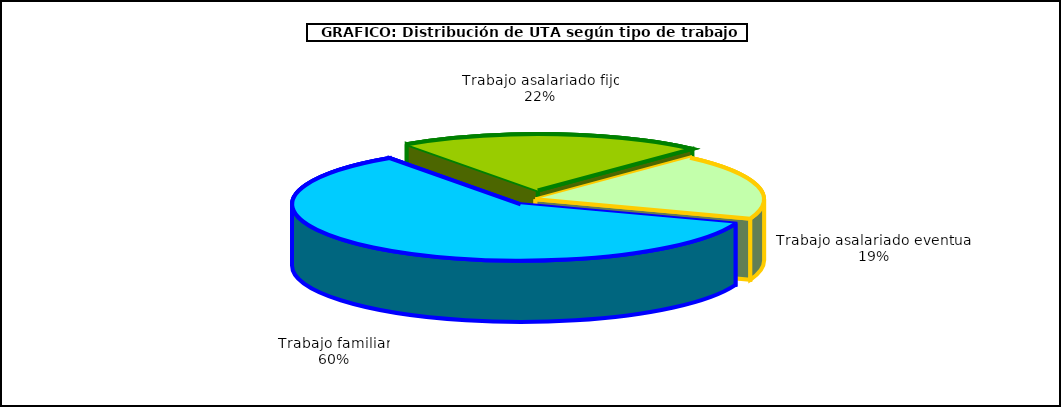
| Category | Series 0 |
|---|---|
| 0 | 485961 |
| 1 | 175092 |
| 2 | 152498 |